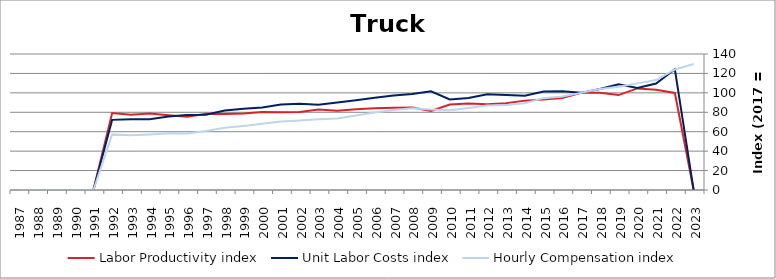
| Category | Labor Productivity index | Unit Labor Costs index | Hourly Compensation index |
|---|---|---|---|
| 2023.0 | 0 | 0 | 129.64 |
| 2022.0 | 99.901 | 124.229 | 124.106 |
| 2021.0 | 103.223 | 109.675 | 113.209 |
| 2020.0 | 104.577 | 104.942 | 109.746 |
| 2019.0 | 97.716 | 108.889 | 106.402 |
| 2018.0 | 100.097 | 103.891 | 103.991 |
| 2017.0 | 100 | 100 | 100 |
| 2016.0 | 94.643 | 101.657 | 96.212 |
| 2015.0 | 93.178 | 101.478 | 94.555 |
| 2014.0 | 92 | 97.137 | 89.367 |
| 2013.0 | 89.387 | 97.862 | 87.476 |
| 2012.0 | 88.297 | 98.485 | 86.96 |
| 2011.0 | 89.034 | 94.748 | 84.358 |
| 2010.0 | 87.994 | 93.167 | 81.981 |
| 2009.0 | 81.44 | 101.666 | 82.797 |
| 2008.0 | 85.031 | 98.945 | 84.134 |
| 2007.0 | 84.63 | 97.371 | 82.405 |
| 2006.0 | 84.093 | 94.97 | 79.863 |
| 2005.0 | 83.049 | 92.483 | 76.806 |
| 2004.0 | 81.676 | 90.183 | 73.658 |
| 2003.0 | 82.751 | 87.875 | 72.718 |
| 2002.0 | 80.411 | 88.837 | 71.435 |
| 2001.0 | 80.126 | 87.994 | 70.506 |
| 2000.0 | 80.236 | 84.88 | 68.104 |
| 1999.0 | 78.86 | 83.595 | 65.923 |
| 1998.0 | 78.12 | 81.891 | 63.974 |
| 1997.0 | 78.402 | 77.505 | 60.766 |
| 1996.0 | 75.292 | 77.178 | 58.109 |
| 1995.0 | 77.025 | 75.718 | 58.322 |
| 1994.0 | 78.665 | 72.72 | 57.205 |
| 1993.0 | 77.466 | 72.881 | 56.458 |
| 1992.0 | 79.278 | 72.203 | 57.241 |
| 1991.0 | 0 | 0 | 0 |
| 1990.0 | 0 | 0 | 0 |
| 1989.0 | 0 | 0 | 0 |
| 1988.0 | 0 | 0 | 0 |
| 1987.0 | 0 | 0 | 0 |